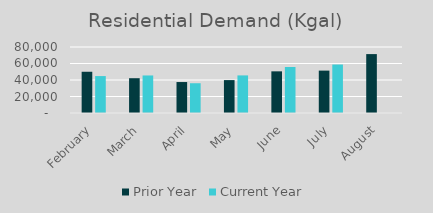
| Category | Prior Year | Current Year |
|---|---|---|
| February | 49996 | 44769 |
| March | 42168 | 45502 |
| April | 37537 | 36081 |
| May | 39883 | 45570 |
| June | 50498 | 55783 |
| July | 51383 | 58740 |
| August | 71400 | 0 |